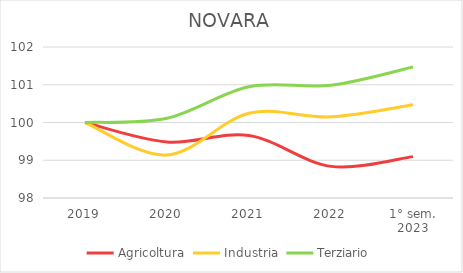
| Category | Agricoltura | Industria | Terziario |
|---|---|---|---|
| 2019 | 100 | 100 | 100 |
| 2020 | 99.483 | 99.137 | 100.113 |
| 2021 | 99.656 | 100.245 | 100.948 |
| 2022 | 98.838 | 100.149 | 100.989 |
| 1° sem.
2023 | 99.096 | 100.469 | 101.469 |